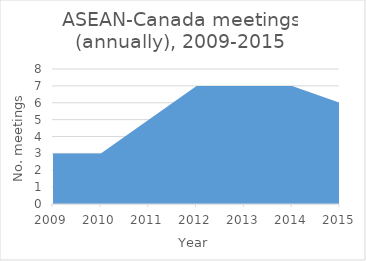
| Category | Number of meetings |
|---|---|
| 2009.0 | 3 |
| 2010.0 | 3 |
| 2011.0 | 5 |
| 2012.0 | 7 |
| 2013.0 | 7 |
| 2014.0 | 7 |
| 2015.0 | 6 |